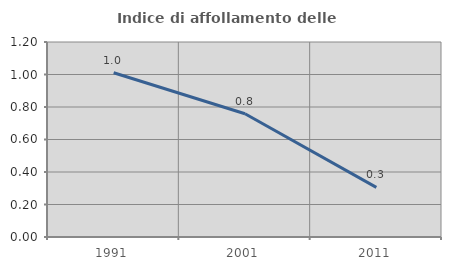
| Category | Indice di affollamento delle abitazioni  |
|---|---|
| 1991.0 | 1.011 |
| 2001.0 | 0.758 |
| 2011.0 | 0.305 |